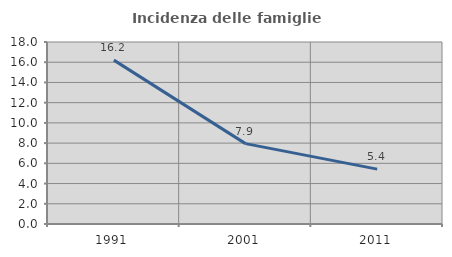
| Category | Incidenza delle famiglie numerose |
|---|---|
| 1991.0 | 16.207 |
| 2001.0 | 7.948 |
| 2011.0 | 5.425 |